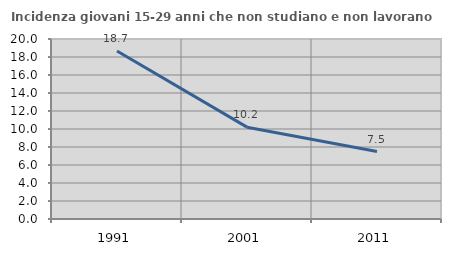
| Category | Incidenza giovani 15-29 anni che non studiano e non lavorano  |
|---|---|
| 1991.0 | 18.667 |
| 2001.0 | 10.204 |
| 2011.0 | 7.5 |